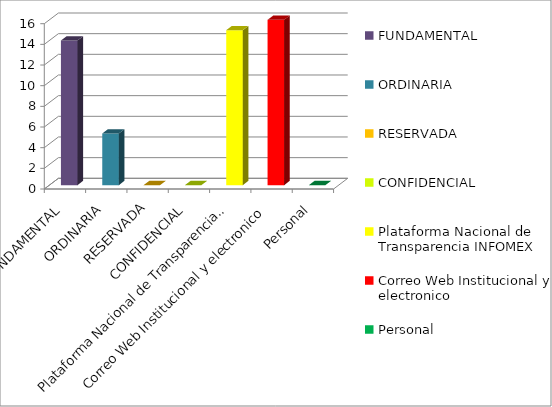
| Category | Series 2 |
|---|---|
| FUNDAMENTAL | 14 |
| ORDINARIA | 5 |
| RESERVADA | 0 |
| CONFIDENCIAL | 0 |
| Plataforma Nacional de Transparencia INFOMEX | 15 |
| Correo Web Institucional y electronico | 16 |
| Personal | 0 |